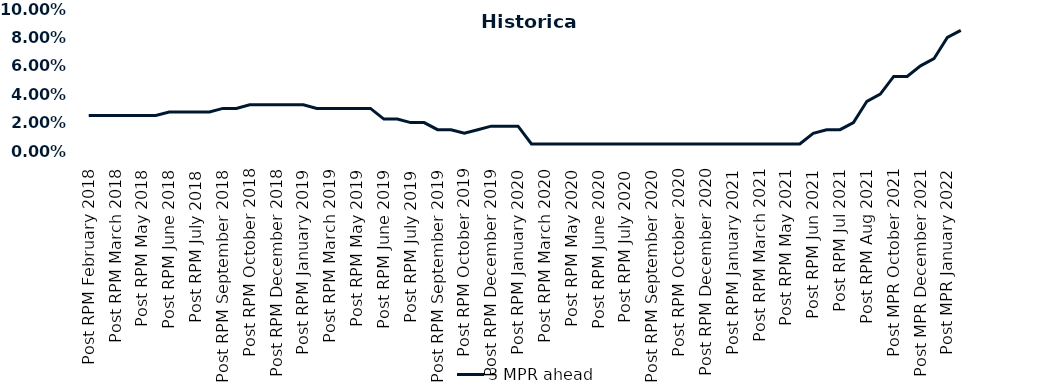
| Category | 3 MPR ahead |
|---|---|
| Post RPM February 2018 | 0.025 |
| Pre RPM March 2018 | 0.025 |
| Post RPM March 2018 | 0.025 |
| Pre RPM May 2018 | 0.025 |
| Post RPM May 2018 | 0.025 |
| Pre RPM June 2018 | 0.025 |
| Post RPM June 2018 | 0.028 |
| Pre RPM July 2018 | 0.028 |
| Post RPM July 2018 | 0.028 |
| Pre RPM September 2018 | 0.028 |
| Post RPM September 2018 | 0.03 |
| Pre RPM October 2018 | 0.03 |
| Post RPM October 2018 | 0.032 |
| Pre RPM December 2018 | 0.032 |
| Post RPM December 2018 | 0.032 |
| Pre RPM January 2019 | 0.032 |
| Post RPM January 2019 | 0.032 |
| Pre RPM March 2019 | 0.03 |
| Post RPM March 2019 | 0.03 |
| Pre RPM May 2019 | 0.03 |
| Post RPM May 2019 | 0.03 |
| Pre RPM June 2019 | 0.03 |
| Post RPM June 2019 | 0.022 |
| Pre RPM July 2019 | 0.022 |
| Post RPM July 2019 | 0.02 |
| Pre RPM September 2019 | 0.02 |
| Post RPM September 2019 | 0.015 |
| Pre RPM October 2019 | 0.015 |
| Post RPM October 2019 | 0.012 |
| Pre RPM December 2019 | 0.015 |
| Post RPM December 2019 | 0.018 |
| Pre RPM January 2020 | 0.018 |
| Post RPM January 2020 | 0.018 |
| Pre RPM March 2020 | 0.005 |
| Post RPM March 2020 | 0.005 |
| Pre RPM May 2020 | 0.005 |
| Post RPM May 2020 | 0.005 |
| Pre RPM June 2020 | 0.005 |
| Post RPM June 2020 | 0.005 |
| Pre RPM July 2020 | 0.005 |
| Post RPM July 2020 | 0.005 |
| Pre RPM September 2020 | 0.005 |
| Post RPM September 2020 | 0.005 |
| Pre RPM October 2020 | 0.005 |
| Post RPM October 2020 | 0.005 |
| Pre RPM December 2020 | 0.005 |
|  Post RPM December 2020 | 0.005 |
| Pre RPM January 2021 | 0.005 |
| Post RPM January 2021 | 0.005 |
|  Pre RPM March 2021 | 0.005 |
|  Post RPM March 2021 | 0.005 |
|  Pre RPM May 2021 | 0.005 |
|  Post RPM May 2021 | 0.005 |
|  Pre RPM Jun 2021 | 0.005 |
|   Post RPM Jun 2021 | 0.012 |
| Pre RPM Jul 2021 | 0.015 |
|  Post RPM Jul 2021 | 0.015 |
| Pre RPM Aug 2021 | 0.02 |
|  Post RPM Aug 2021 | 0.035 |
| Pre MPR October 2021 | 0.04 |
| Post MPR October 2021 | 0.052 |
| Pre MPR December 2021 | 0.052 |
| Post MPR December 2021 | 0.06 |
| Pre MPR January 2022 | 0.065 |
| Post MPR January 2022 | 0.08 |
| Pre MPR March 2022 | 0.085 |